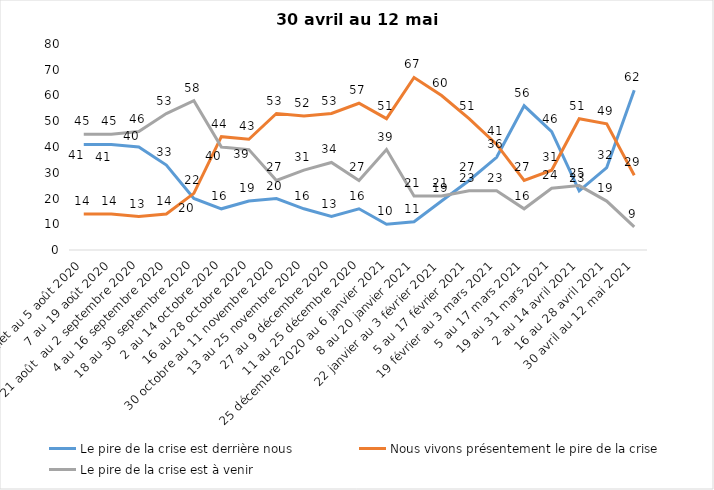
| Category | Le pire de la crise est derrière nous | Nous vivons présentement le pire de la crise | Le pire de la crise est à venir |
|---|---|---|---|
| 24 juillet au 5 août 2020 | 41 | 14 | 45 |
| 7 au 19 août 2020 | 41 | 14 | 45 |
| 21 août  au 2 septembre 2020 | 40 | 13 | 46 |
| 4 au 16 septembre 2020 | 33 | 14 | 53 |
| 18 au 30 septembre 2020 | 20 | 22 | 58 |
| 2 au 14 octobre 2020 | 16 | 44 | 40 |
| 16 au 28 octobre 2020 | 19 | 43 | 39 |
| 30 octobre au 11 novembre 2020 | 20 | 53 | 27 |
| 13 au 25 novembre 2020 | 16 | 52 | 31 |
| 27 au 9 décembre 2020 | 13 | 53 | 34 |
| 11 au 25 décembre 2020 | 16 | 57 | 27 |
| 25 décembre 2020 au 6 janvier 2021 | 10 | 51 | 39 |
| 8 au 20 janvier 2021 | 11 | 67 | 21 |
| 22 janvier au 3 février 2021 | 19 | 60 | 21 |
| 5 au 17 février 2021 | 27 | 51 | 23 |
| 19 février au 3 mars 2021 | 36 | 41 | 23 |
| 5 au 17 mars 2021 | 56 | 27 | 16 |
| 19 au 31 mars 2021 | 46 | 31 | 24 |
| 2 au 14 avril 2021 | 23 | 51 | 25 |
| 16 au 28 avril 2021 | 32 | 49 | 19 |
| 30 avril au 12 mai 2021 | 62 | 29 | 9 |